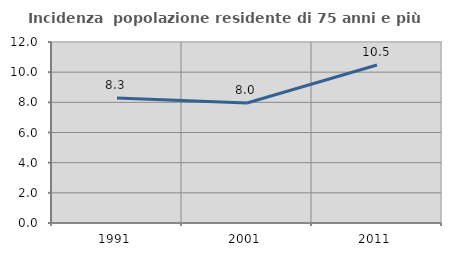
| Category | Incidenza  popolazione residente di 75 anni e più |
|---|---|
| 1991.0 | 8.283 |
| 2001.0 | 7.959 |
| 2011.0 | 10.476 |